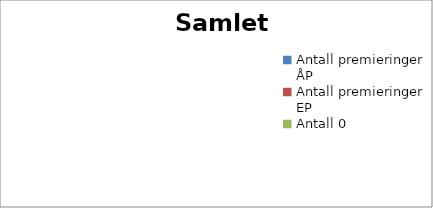
| Category | Antall starter |
|---|---|
| Antall premieringer ÅP | 0 |
| Antall premieringer EP | 0 |
| Antall 0 | 0 |